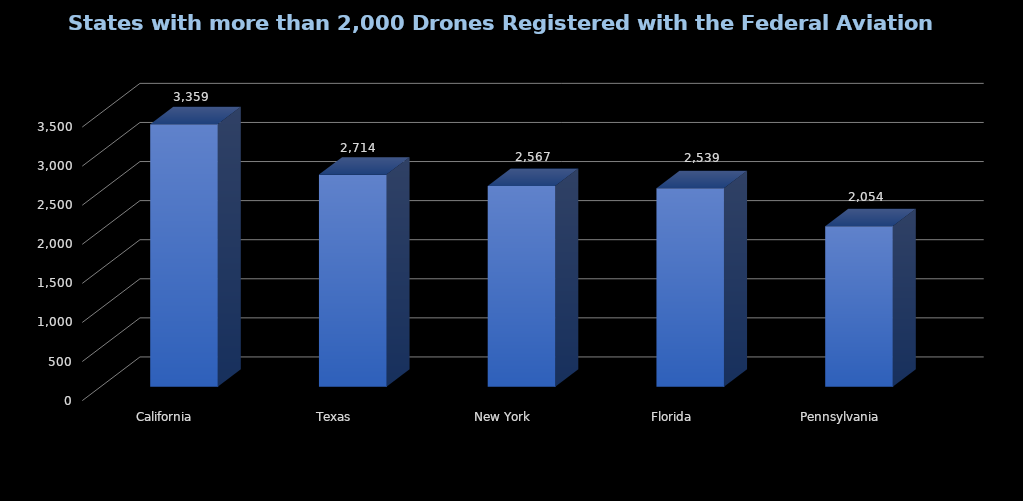
| Category | Series 0 |
|---|---|
| California | 3359 |
| Texas | 2714 |
| New York | 2567 |
| Florida | 2539 |
| Pennsylvania | 2054 |